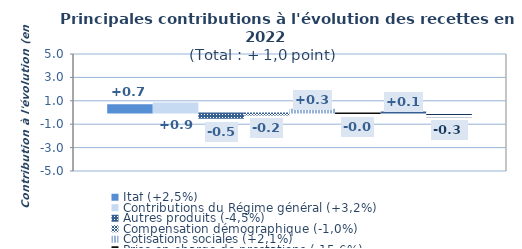
| Category | Itaf (+2,5%) | Contributions du Régime général (+3,2%) | Autres produits (-4,5%) | Compensation démographique (-1,0%) | Cotisations sociales (+2,1%) | Prise en charge de prestations (-15,6%) | Contribution Sociale Généralisée (+3,5%) | Cotisations prises en charge par l'Etat (-59,3%) |
|---|---|---|---|---|---|---|---|---|
| Contri croiss | 0.711 | 0.862 | -0.458 | -0.168 | 0.321 | -0.046 | 0.089 | -0.329 |